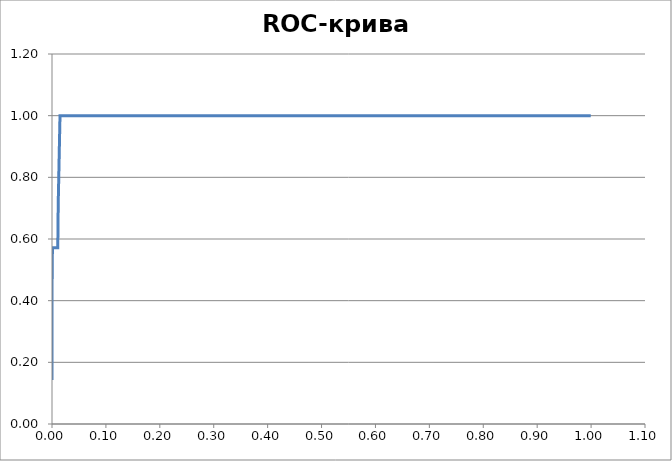
| Category | sens |
|---|---|
| 0.0 | 0.143 |
| 0.0 | 0.286 |
| 0.0 | 0.429 |
| 0.0 | 0.429 |
| 0.0008244023083264773 | 0.571 |
| 0.0008244023083264773 | 0.571 |
| 0.0016488046166529546 | 0.571 |
| 0.002473206924979432 | 0.571 |
| 0.0032976092333057982 | 0.571 |
| 0.004122011541632276 | 0.571 |
| 0.004946413849958753 | 0.571 |
| 0.00577081615828523 | 0.571 |
| 0.0065952184666117075 | 0.571 |
| 0.007419620774938185 | 0.571 |
| 0.008244023083264662 | 0.571 |
| 0.00906842539159114 | 0.571 |
| 0.009892827699917506 | 0.571 |
| 0.010717230008243983 | 0.571 |
| 0.01154163231657046 | 0.714 |
| 0.01154163231657046 | 0.714 |
| 0.012366034624896938 | 0.714 |
| 0.013190436933223415 | 0.857 |
| 0.013190436933223415 | 0.857 |
| 0.014014839241549892 | 0.857 |
| 0.01483924154987637 | 1 |
| 0.01483924154987637 | 1 |
| 0.015663643858202847 | 1 |
| 0.016488046166529213 | 1 |
| 0.01731244847485569 | 1 |
| 0.018136850783182168 | 1 |
| 0.018961253091508645 | 1 |
| 0.019785655399835123 | 1 |
| 0.0206100577081616 | 1 |
| 0.021434460016488077 | 1 |
| 0.022258862324814555 | 1 |
| 0.02308326463314092 | 1 |
| 0.023907666941467398 | 1 |
| 0.024732069249793875 | 1 |
| 0.025556471558120353 | 1 |
| 0.02638087386644683 | 1 |
| 0.027205276174773307 | 1 |
| 0.028029678483099785 | 1 |
| 0.028854080791426262 | 1 |
| 0.02967848309975263 | 1 |
| 0.030502885408079106 | 1 |
| 0.03132728771640558 | 1 |
| 0.03215169002473206 | 1 |
| 0.03297609233305854 | 1 |
| 0.033800494641385015 | 1 |
| 0.03462489694971149 | 1 |
| 0.03544929925803797 | 1 |
| 0.036273701566364336 | 1 |
| 0.03709810387469081 | 1 |
| 0.03792250618301729 | 1 |
| 0.03874690849134377 | 1 |
| 0.039571310799670245 | 1 |
| 0.04039571310799672 | 1 |
| 0.0412201154163232 | 1 |
| 0.04204451772464968 | 1 |
| 0.04286892003297604 | 1 |
| 0.04369332234130252 | 1 |
| 0.044517724649629 | 1 |
| 0.045342126957955475 | 1 |
| 0.04616652926628195 | 1 |
| 0.04699093157460843 | 1 |
| 0.04781533388293491 | 1 |
| 0.048639736191261385 | 1 |
| 0.04946413849958775 | 1 |
| 0.05028854080791423 | 1 |
| 0.051112943116240706 | 1 |
| 0.05193734542456718 | 1 |
| 0.05276174773289366 | 1 |
| 0.05358615004122014 | 1 |
| 0.054410552349546615 | 1 |
| 0.05523495465787309 | 1 |
| 0.05605935696619946 | 1 |
| 0.056883759274525936 | 1 |
| 0.05770816158285241 | 1 |
| 0.05853256389117889 | 1 |
| 0.05935696619950537 | 1 |
| 0.060181368507831845 | 1 |
| 0.06100577081615832 | 1 |
| 0.0618301731244848 | 1 |
| 0.06265457543281117 | 1 |
| 0.06347897774113764 | 1 |
| 0.06430338004946412 | 1 |
| 0.0651277823577906 | 1 |
| 0.06595218466611708 | 1 |
| 0.06677658697444355 | 1 |
| 0.06760098928277003 | 1 |
| 0.06842539159109651 | 1 |
| 0.06924979389942287 | 1 |
| 0.07007419620774935 | 1 |
| 0.07089859851607583 | 1 |
| 0.0717230008244023 | 1 |
| 0.07254740313272878 | 1 |
| 0.07337180544105526 | 1 |
| 0.07419620774938174 | 1 |
| 0.07502061005770821 | 1 |
| 0.07584501236603458 | 1 |
| 0.07666941467436106 | 1 |
| 0.07749381698268754 | 1 |
| 0.07831821929101401 | 1 |
| 0.07914262159934049 | 1 |
| 0.07996702390766697 | 1 |
| 0.08079142621599344 | 1 |
| 0.08161582852431992 | 1 |
| 0.08244023083264629 | 1 |
| 0.08326463314097277 | 1 |
| 0.08408903544929924 | 1 |
| 0.08491343775762572 | 1 |
| 0.0857378400659522 | 1 |
| 0.08656224237427868 | 1 |
| 0.08738664468260515 | 1 |
| 0.08821104699093163 | 1 |
| 0.089035449299258 | 1 |
| 0.08985985160758447 | 1 |
| 0.09068425391591095 | 1 |
| 0.09150865622423743 | 1 |
| 0.0923330585325639 | 1 |
| 0.09315746084089038 | 1 |
| 0.09398186314921686 | 1 |
| 0.09480626545754323 | 1 |
| 0.0956306677658697 | 1 |
| 0.09645507007419618 | 1 |
| 0.09727947238252266 | 1 |
| 0.09810387469084914 | 1 |
| 0.09892827699917561 | 1 |
| 0.09975267930750209 | 1 |
| 0.10057708161582857 | 1 |
| 0.10140148392415493 | 1 |
| 0.10222588623248141 | 1 |
| 0.10305028854080789 | 1 |
| 0.10387469084913437 | 1 |
| 0.10469909315746084 | 1 |
| 0.10552349546578732 | 1 |
| 0.1063478977741138 | 1 |
| 0.10717230008244027 | 1 |
| 0.10799670239076664 | 1 |
| 0.10882110469909312 | 1 |
| 0.1096455070074196 | 1 |
| 0.11046990931574607 | 1 |
| 0.11129431162407255 | 1 |
| 0.11211871393239903 | 1 |
| 0.1129431162407255 | 1 |
| 0.11376751854905198 | 1 |
| 0.11459192085737835 | 1 |
| 0.11541632316570483 | 1 |
| 0.1162407254740313 | 1 |
| 0.11706512778235778 | 1 |
| 0.11788953009068426 | 1 |
| 0.11871393239901074 | 1 |
| 0.11953833470733721 | 1 |
| 0.12036273701566369 | 1 |
| 0.12118713932399006 | 1 |
| 0.12201154163231653 | 1 |
| 0.12283594394064301 | 1 |
| 0.12366034624896949 | 1 |
| 0.12448474855729597 | 1 |
| 0.12530915086562244 | 1 |
| 0.12613355317394892 | 1 |
| 0.1269579554822754 | 1 |
| 0.12778235779060176 | 1 |
| 0.12860676009892824 | 1 |
| 0.12943116240725472 | 1 |
| 0.1302555647155812 | 1 |
| 0.13107996702390767 | 1 |
| 0.13190436933223415 | 1 |
| 0.13272877164056063 | 1 |
| 0.1335531739488871 | 1 |
| 0.13437757625721347 | 1 |
| 0.13520197856553995 | 1 |
| 0.13602638087386643 | 1 |
| 0.1368507831821929 | 1 |
| 0.13767518549051938 | 1 |
| 0.13849958779884586 | 1 |
| 0.13932399010717234 | 1 |
| 0.1401483924154988 | 1 |
| 0.14097279472382518 | 1 |
| 0.14179719703215166 | 1 |
| 0.14262159934047813 | 1 |
| 0.1434460016488046 | 1 |
| 0.1442704039571311 | 1 |
| 0.14509480626545757 | 1 |
| 0.14591920857378404 | 1 |
| 0.14674361088211052 | 1 |
| 0.1475680131904369 | 1 |
| 0.14839241549876336 | 1 |
| 0.14921681780708984 | 1 |
| 0.15004122011541632 | 1 |
| 0.1508656224237428 | 1 |
| 0.15169002473206927 | 1 |
| 0.15251442704039575 | 1 |
| 0.15333882934872223 | 1 |
| 0.1541632316570486 | 1 |
| 0.15498763396537507 | 1 |
| 0.15581203627370155 | 1 |
| 0.15663643858202803 | 1 |
| 0.1574608408903545 | 1 |
| 0.15828524319868098 | 1 |
| 0.15910964550700746 | 1 |
| 0.15993404781533394 | 1 |
| 0.1607584501236603 | 1 |
| 0.16158285243198678 | 1 |
| 0.16240725474031326 | 1 |
| 0.16323165704863973 | 1 |
| 0.1640560593569662 | 1 |
| 0.1648804616652927 | 1 |
| 0.16570486397361917 | 1 |
| 0.16652926628194564 | 1 |
| 0.167353668590272 | 1 |
| 0.1681780708985985 | 1 |
| 0.16900247320692496 | 1 |
| 0.16982687551525144 | 1 |
| 0.17065127782357792 | 1 |
| 0.1714756801319044 | 1 |
| 0.17230008244023087 | 1 |
| 0.17312448474855735 | 1 |
| 0.17394888705688372 | 1 |
| 0.1747732893652102 | 1 |
| 0.17559769167353667 | 1 |
| 0.17642209398186315 | 1 |
| 0.17724649629018963 | 1 |
| 0.1780708985985161 | 1 |
| 0.17889530090684258 | 1 |
| 0.17971970321516906 | 1 |
| 0.18054410552349542 | 1 |
| 0.1813685078318219 | 1 |
| 0.18219291014014838 | 1 |
| 0.18301731244847486 | 1 |
| 0.18384171475680133 | 1 |
| 0.1846661170651278 | 1 |
| 0.1854905193734543 | 1 |
| 0.18631492168178065 | 1 |
| 0.18713932399010713 | 1 |
| 0.1879637262984336 | 1 |
| 0.18878812860676009 | 1 |
| 0.18961253091508656 | 1 |
| 0.19043693322341304 | 1 |
| 0.19126133553173952 | 1 |
| 0.192085737840066 | 1 |
| 0.19291014014839236 | 1 |
| 0.19373454245671884 | 1 |
| 0.19455894476504532 | 1 |
| 0.1953833470733718 | 1 |
| 0.19620774938169827 | 1 |
| 0.19703215169002475 | 1 |
| 0.19785655399835123 | 1 |
| 0.1986809563066777 | 1 |
| 0.19950535861500407 | 1 |
| 0.20032976092333055 | 1 |
| 0.20115416323165702 | 1 |
| 0.2019785655399835 | 1 |
| 0.20280296784830998 | 1 |
| 0.20362737015663646 | 1 |
| 0.20445177246496293 | 1 |
| 0.2052761747732894 | 1 |
| 0.20610057708161578 | 1 |
| 0.20692497938994225 | 1 |
| 0.20774938169826873 | 1 |
| 0.2085737840065952 | 1 |
| 0.20939818631492169 | 1 |
| 0.21022258862324816 | 1 |
| 0.21104699093157464 | 1 |
| 0.21187139323990112 | 1 |
| 0.21269579554822748 | 1 |
| 0.21352019785655396 | 1 |
| 0.21434460016488044 | 1 |
| 0.21516900247320692 | 1 |
| 0.2159934047815334 | 1 |
| 0.21681780708985987 | 1 |
| 0.21764220939818635 | 1 |
| 0.21846661170651283 | 1 |
| 0.2192910140148392 | 1 |
| 0.22011541632316567 | 1 |
| 0.22093981863149215 | 1 |
| 0.22176422093981862 | 1 |
| 0.2225886232481451 | 1 |
| 0.22341302555647158 | 1 |
| 0.22423742786479806 | 1 |
| 0.22506183017312453 | 1 |
| 0.2258862324814509 | 1 |
| 0.22671063478977738 | 1 |
| 0.22753503709810385 | 1 |
| 0.22835943940643033 | 1 |
| 0.2291838417147568 | 1 |
| 0.23000824402308329 | 1 |
| 0.23083264633140976 | 1 |
| 0.23165704863973624 | 1 |
| 0.2324814509480626 | 1 |
| 0.23330585325638908 | 1 |
| 0.23413025556471556 | 1 |
| 0.23495465787304204 | 1 |
| 0.23577906018136852 | 1 |
| 0.236603462489695 | 1 |
| 0.23742786479802147 | 1 |
| 0.23825226710634795 | 1 |
| 0.23907666941467431 | 1 |
| 0.2399010717230008 | 1 |
| 0.24072547403132727 | 1 |
| 0.24154987633965375 | 1 |
| 0.24237427864798022 | 1 |
| 0.2431986809563067 | 1 |
| 0.24402308326463318 | 1 |
| 0.24484748557295966 | 1 |
| 0.24567188788128602 | 1 |
| 0.2464962901896125 | 1 |
| 0.24732069249793898 | 1 |
| 0.24814509480626545 | 1 |
| 0.24896949711459193 | 1 |
| 0.2497938994229184 | 1 |
| 0.2506183017312449 | 1 |
| 0.25144270403957136 | 1 |
| 0.25226710634789773 | 1 |
| 0.2530915086562242 | 1 |
| 0.2539159109645507 | 1 |
| 0.25474031327287716 | 1 |
| 0.25556471558120364 | 1 |
| 0.2563891178895301 | 1 |
| 0.2572135201978566 | 1 |
| 0.25803792250618307 | 1 |
| 0.25886232481450944 | 1 |
| 0.2596867271228359 | 1 |
| 0.2605111294311624 | 1 |
| 0.26133553173948887 | 1 |
| 0.26215993404781535 | 1 |
| 0.2629843363561418 | 1 |
| 0.2638087386644683 | 1 |
| 0.2646331409727948 | 1 |
| 0.26545754328112114 | 1 |
| 0.2662819455894476 | 1 |
| 0.2671063478977741 | 1 |
| 0.2679307502061006 | 1 |
| 0.26875515251442705 | 1 |
| 0.26957955482275353 | 1 |
| 0.27040395713108 | 1 |
| 0.2712283594394065 | 1 |
| 0.27205276174773285 | 1 |
| 0.27287716405605933 | 1 |
| 0.2737015663643858 | 1 |
| 0.2745259686727123 | 1 |
| 0.27535037098103876 | 1 |
| 0.27617477328936524 | 1 |
| 0.2769991755976917 | 1 |
| 0.2778235779060181 | 1 |
| 0.27864798021434456 | 1 |
| 0.27947238252267104 | 1 |
| 0.2802967848309975 | 1 |
| 0.281121187139324 | 1 |
| 0.28194558944765047 | 1 |
| 0.28276999175597695 | 1 |
| 0.2835943940643034 | 1 |
| 0.2844187963726298 | 1 |
| 0.28524319868095627 | 1 |
| 0.28606760098928274 | 1 |
| 0.2868920032976092 | 1 |
| 0.2877164056059357 | 1 |
| 0.2885408079142622 | 1 |
| 0.28936521022258865 | 1 |
| 0.29018961253091513 | 1 |
| 0.2910140148392415 | 1 |
| 0.291838417147568 | 1 |
| 0.29266281945589445 | 1 |
| 0.29348722176422093 | 1 |
| 0.2943116240725474 | 1 |
| 0.2951360263808739 | 1 |
| 0.29596042868920036 | 1 |
| 0.29678483099752684 | 1 |
| 0.2976092333058532 | 1 |
| 0.2984336356141797 | 1 |
| 0.29925803792250616 | 1 |
| 0.30008244023083264 | 1 |
| 0.3009068425391591 | 1 |
| 0.3017312448474856 | 1 |
| 0.30255564715581207 | 1 |
| 0.30338004946413855 | 1 |
| 0.3042044517724649 | 1 |
| 0.3050288540807914 | 1 |
| 0.30585325638911787 | 1 |
| 0.30667765869744434 | 1 |
| 0.3075020610057708 | 1 |
| 0.3083264633140973 | 1 |
| 0.3091508656224238 | 1 |
| 0.30997526793075025 | 1 |
| 0.3107996702390766 | 1 |
| 0.3116240725474031 | 1 |
| 0.3124484748557296 | 1 |
| 0.31327287716405605 | 1 |
| 0.31409727947238253 | 1 |
| 0.314921681780709 | 1 |
| 0.3157460840890355 | 1 |
| 0.31657048639736196 | 1 |
| 0.3173948887056883 | 1 |
| 0.3182192910140148 | 1 |
| 0.3190436933223413 | 1 |
| 0.31986809563066776 | 1 |
| 0.32069249793899424 | 1 |
| 0.3215169002473207 | 1 |
| 0.3223413025556472 | 1 |
| 0.32316570486397367 | 1 |
| 0.32399010717230003 | 1 |
| 0.3248145094806265 | 1 |
| 0.325638911788953 | 1 |
| 0.32646331409727947 | 1 |
| 0.32728771640560594 | 1 |
| 0.3281121187139324 | 1 |
| 0.3289365210222589 | 1 |
| 0.3297609233305854 | 1 |
| 0.33058532563891174 | 1 |
| 0.3314097279472382 | 1 |
| 0.3322341302555647 | 1 |
| 0.3330585325638912 | 1 |
| 0.33388293487221765 | 1 |
| 0.33470733718054413 | 1 |
| 0.3355317394888706 | 1 |
| 0.3363561417971971 | 1 |
| 0.33718054410552345 | 1 |
| 0.3380049464138499 | 1 |
| 0.3388293487221764 | 1 |
| 0.3396537510305029 | 1 |
| 0.34047815333882936 | 1 |
| 0.34130255564715584 | 1 |
| 0.3421269579554823 | 1 |
| 0.3429513602638088 | 1 |
| 0.34377576257213516 | 1 |
| 0.34460016488046163 | 1 |
| 0.3454245671887881 | 1 |
| 0.3462489694971146 | 1 |
| 0.34707337180544107 | 1 |
| 0.34789777411376754 | 1 |
| 0.348722176422094 | 1 |
| 0.3495465787304205 | 1 |
| 0.35037098103874686 | 1 |
| 0.35119538334707334 | 1 |
| 0.3520197856553998 | 1 |
| 0.3528441879637263 | 1 |
| 0.3536685902720528 | 1 |
| 0.35449299258037925 | 1 |
| 0.35531739488870573 | 1 |
| 0.3561417971970322 | 1 |
| 0.3569661995053586 | 1 |
| 0.35779060181368505 | 1 |
| 0.3586150041220115 | 1 |
| 0.359439406430338 | 1 |
| 0.3602638087386645 | 1 |
| 0.36108821104699096 | 1 |
| 0.36191261335531744 | 1 |
| 0.3627370156636439 | 1 |
| 0.3635614179719703 | 1 |
| 0.36438582028029676 | 1 |
| 0.36521022258862323 | 1 |
| 0.3660346248969497 | 1 |
| 0.3668590272052762 | 1 |
| 0.36768342951360267 | 1 |
| 0.36850783182192914 | 1 |
| 0.3693322341302555 | 1 |
| 0.370156636438582 | 1 |
| 0.37098103874690846 | 1 |
| 0.37180544105523494 | 1 |
| 0.3726298433635614 | 1 |
| 0.3734542456718879 | 1 |
| 0.3742786479802144 | 1 |
| 0.37510305028854085 | 1 |
| 0.3759274525968672 | 1 |
| 0.3767518549051937 | 1 |
| 0.37757625721352017 | 1 |
| 0.37840065952184665 | 1 |
| 0.3792250618301731 | 1 |
| 0.3800494641384996 | 1 |
| 0.3808738664468261 | 1 |
| 0.38169826875515256 | 1 |
| 0.3825226710634789 | 1 |
| 0.3833470733718054 | 1 |
| 0.3841714756801319 | 1 |
| 0.38499587798845836 | 1 |
| 0.38582028029678483 | 1 |
| 0.3866446826051113 | 1 |
| 0.3874690849134378 | 1 |
| 0.38829348722176427 | 1 |
| 0.38911788953009063 | 1 |
| 0.3899422918384171 | 1 |
| 0.3907666941467436 | 1 |
| 0.39159109645507006 | 1 |
| 0.39241549876339654 | 1 |
| 0.393239901071723 | 1 |
| 0.3940643033800495 | 1 |
| 0.394888705688376 | 1 |
| 0.39571310799670234 | 1 |
| 0.3965375103050288 | 1 |
| 0.3973619126133553 | 1 |
| 0.39818631492168177 | 1 |
| 0.39901071723000825 | 1 |
| 0.3998351195383347 | 1 |
| 0.4006595218466612 | 1 |
| 0.4014839241549877 | 1 |
| 0.40230832646331405 | 1 |
| 0.4031327287716405 | 1 |
| 0.403957131079967 | 1 |
| 0.4047815333882935 | 1 |
| 0.40560593569661996 | 1 |
| 0.40643033800494643 | 1 |
| 0.4072547403132729 | 1 |
| 0.4080791426215994 | 1 |
| 0.40890354492992576 | 1 |
| 0.40972794723825223 | 1 |
| 0.4105523495465787 | 1 |
| 0.4113767518549052 | 1 |
| 0.41220115416323166 | 1 |
| 0.41302555647155814 | 1 |
| 0.4138499587798846 | 1 |
| 0.4146743610882111 | 1 |
| 0.41549876339653746 | 1 |
| 0.41632316570486394 | 1 |
| 0.4171475680131904 | 1 |
| 0.4179719703215169 | 1 |
| 0.41879637262984337 | 1 |
| 0.41962077493816985 | 1 |
| 0.4204451772464963 | 1 |
| 0.4212695795548228 | 1 |
| 0.42209398186314917 | 1 |
| 0.42291838417147565 | 1 |
| 0.4237427864798021 | 1 |
| 0.4245671887881286 | 1 |
| 0.4253915910964551 | 1 |
| 0.42621599340478156 | 1 |
| 0.42704039571310803 | 1 |
| 0.4278647980214345 | 1 |
| 0.4286892003297609 | 1 |
| 0.42951360263808736 | 1 |
| 0.43033800494641383 | 1 |
| 0.4311624072547403 | 1 |
| 0.4319868095630668 | 1 |
| 0.43281121187139326 | 1 |
| 0.43363561417971974 | 1 |
| 0.4344600164880462 | 1 |
| 0.4352844187963726 | 1 |
| 0.43610882110469906 | 1 |
| 0.43693322341302554 | 1 |
| 0.437757625721352 | 1 |
| 0.4385820280296785 | 1 |
| 0.43940643033800497 | 1 |
| 0.44023083264633145 | 1 |
| 0.4410552349546579 | 1 |
| 0.4418796372629843 | 1 |
| 0.44270403957131077 | 1 |
| 0.44352844187963725 | 1 |
| 0.4443528441879637 | 1 |
| 0.4451772464962902 | 1 |
| 0.4460016488046167 | 1 |
| 0.44682605111294316 | 1 |
| 0.44765045342126963 | 1 |
| 0.448474855729596 | 1 |
| 0.4492992580379225 | 1 |
| 0.45012366034624895 | 1 |
| 0.45094806265457543 | 1 |
| 0.4517724649629019 | 1 |
| 0.4525968672712284 | 1 |
| 0.45342126957955486 | 1 |
| 0.45424567188788134 | 1 |
| 0.4550700741962077 | 1 |
| 0.4558944765045342 | 1 |
| 0.45671887881286066 | 1 |
| 0.45754328112118714 | 1 |
| 0.4583676834295136 | 1 |
| 0.4591920857378401 | 1 |
| 0.46001648804616657 | 1 |
| 0.46084089035449294 | 1 |
| 0.4616652926628194 | 1 |
| 0.4624896949711459 | 1 |
| 0.46331409727947237 | 1 |
| 0.46413849958779885 | 1 |
| 0.4649629018961253 | 1 |
| 0.4657873042044518 | 1 |
| 0.4666117065127783 | 1 |
| 0.46743610882110465 | 1 |
| 0.4682605111294311 | 1 |
| 0.4690849134377576 | 1 |
| 0.4699093157460841 | 1 |
| 0.47073371805441055 | 1 |
| 0.47155812036273703 | 1 |
| 0.4723825226710635 | 1 |
| 0.47320692497939 | 1 |
| 0.47403132728771635 | 1 |
| 0.47485572959604283 | 1 |
| 0.4756801319043693 | 1 |
| 0.4765045342126958 | 1 |
| 0.47732893652102226 | 1 |
| 0.47815333882934874 | 1 |
| 0.4789777411376752 | 1 |
| 0.4798021434460017 | 1 |
| 0.48062654575432806 | 1 |
| 0.48145094806265454 | 1 |
| 0.482275350370981 | 1 |
| 0.4830997526793075 | 1 |
| 0.48392415498763397 | 1 |
| 0.48474855729596045 | 1 |
| 0.4855729596042869 | 1 |
| 0.4863973619126134 | 1 |
| 0.48722176422093977 | 1 |
| 0.48804616652926625 | 1 |
| 0.4888705688375927 | 1 |
| 0.4896949711459192 | 1 |
| 0.4905193734542457 | 1 |
| 0.49134377576257215 | 1 |
| 0.49216817807089863 | 1 |
| 0.4929925803792251 | 1 |
| 0.4938169826875515 | 1 |
| 0.49464138499587795 | 1 |
| 0.49546578730420443 | 1 |
| 0.4962901896125309 | 1 |
| 0.4971145919208574 | 1 |
| 0.49793899422918386 | 1 |
| 0.49876339653751034 | 1 |
| 0.4995877988458368 | 1 |
| 0.5004122011541632 | 1 |
| 0.5012366034624898 | 1 |
| 0.5020610057708161 | 1 |
| 0.5028854080791426 | 1 |
| 0.5037098103874691 | 1 |
| 0.5045342126957956 | 1 |
| 0.505358615004122 | 1 |
| 0.5061830173124484 | 1 |
| 0.507007419620775 | 1 |
| 0.5078318219291014 | 1 |
| 0.5086562242374278 | 1 |
| 0.5094806265457543 | 1 |
| 0.5103050288540808 | 1 |
| 0.5111294311624073 | 1 |
| 0.5119538334707336 | 1 |
| 0.5127782357790602 | 1 |
| 0.5136026380873866 | 1 |
| 0.5144270403957132 | 1 |
| 0.5152514427040396 | 1 |
| 0.516075845012366 | 1 |
| 0.5169002473206925 | 1 |
| 0.517724649629019 | 1 |
| 0.5185490519373455 | 1 |
| 0.5193734542456718 | 1 |
| 0.5201978565539984 | 1 |
| 0.5210222588623248 | 1 |
| 0.5218466611706513 | 1 |
| 0.5226710634789777 | 1 |
| 0.5234954657873042 | 1 |
| 0.5243198680956307 | 1 |
| 0.5251442704039571 | 1 |
| 0.5259686727122836 | 1 |
| 0.52679307502061 | 1 |
| 0.5276174773289366 | 1 |
| 0.528441879637263 | 1 |
| 0.5292662819455894 | 1 |
| 0.5300906842539159 | 1 |
| 0.5309150865622424 | 1 |
| 0.5317394888705689 | 1 |
| 0.5325638911788952 | 1 |
| 0.5333882934872218 | 1 |
| 0.5342126957955482 | 1 |
| 0.5350370981038747 | 1 |
| 0.5358615004122012 | 1 |
| 0.5366859027205276 | 1 |
| 0.5375103050288541 | 1 |
| 0.5383347073371805 | 1 |
| 0.5391591096455071 | 1 |
| 0.5399835119538334 | 1 |
| 0.54080791426216 | 1 |
| 0.5416323165704864 | 1 |
| 0.5424567188788129 | 1 |
| 0.5432811211871393 | 1 |
| 0.5441055234954658 | 1 |
| 0.5449299258037923 | 1 |
| 0.5457543281121187 | 1 |
| 0.5465787304204452 | 1 |
| 0.5474031327287716 | 1 |
| 0.5482275350370981 | 1 |
| 0.5490519373454246 | 1 |
| 0.549876339653751 | 1 |
| 0.5507007419620775 | 1 |
| 0.5515251442704039 | 1 |
| 0.5523495465787305 | 1 |
| 0.5531739488870568 | 1 |
| 0.5539983511953833 | 1 |
| 0.5548227535037098 | 1 |
| 0.5556471558120363 | 1 |
| 0.5564715581203628 | 1 |
| 0.5572959604286891 | 1 |
| 0.5581203627370157 | 1 |
| 0.5589447650453421 | 1 |
| 0.5597691673536687 | 1 |
| 0.560593569661995 | 1 |
| 0.5614179719703215 | 1 |
| 0.562242374278648 | 1 |
| 0.5630667765869745 | 1 |
| 0.5638911788953009 | 1 |
| 0.5647155812036273 | 1 |
| 0.5655399835119539 | 1 |
| 0.5663643858202803 | 1 |
| 0.5671887881286067 | 1 |
| 0.5680131904369332 | 1 |
| 0.5688375927452597 | 1 |
| 0.5696619950535862 | 1 |
| 0.5704863973619125 | 1 |
| 0.5713107996702391 | 1 |
| 0.5721352019785655 | 1 |
| 0.5729596042868921 | 1 |
| 0.5737840065952184 | 1 |
| 0.5746084089035449 | 1 |
| 0.5754328112118714 | 1 |
| 0.5762572135201979 | 1 |
| 0.5770816158285244 | 1 |
| 0.5779060181368507 | 1 |
| 0.5787304204451773 | 1 |
| 0.5795548227535037 | 1 |
| 0.5803792250618302 | 1 |
| 0.5812036273701566 | 1 |
| 0.5820280296784831 | 1 |
| 0.5828524319868096 | 1 |
| 0.583676834295136 | 1 |
| 0.5845012366034625 | 1 |
| 0.5853256389117889 | 1 |
| 0.5861500412201155 | 1 |
| 0.5869744435284419 | 1 |
| 0.5877988458367683 | 1 |
| 0.5886232481450948 | 1 |
| 0.5894476504534213 | 1 |
| 0.5902720527617478 | 1 |
| 0.5910964550700741 | 1 |
| 0.5919208573784007 | 1 |
| 0.5927452596867271 | 1 |
| 0.5935696619950536 | 1 |
| 0.59439406430338 | 1 |
| 0.5952184666117065 | 1 |
| 0.596042868920033 | 1 |
| 0.5968672712283594 | 1 |
| 0.597691673536686 | 1 |
| 0.5985160758450123 | 1 |
| 0.5993404781533389 | 1 |
| 0.6001648804616653 | 1 |
| 0.6009892827699918 | 1 |
| 0.6018136850783182 | 1 |
| 0.6026380873866447 | 1 |
| 0.6034624896949712 | 1 |
| 0.6042868920032975 | 1 |
| 0.6051112943116241 | 1 |
| 0.6059356966199505 | 1 |
| 0.606760098928277 | 1 |
| 0.6075845012366035 | 1 |
| 0.6084089035449299 | 1 |
| 0.6092333058532564 | 1 |
| 0.6100577081615828 | 1 |
| 0.6108821104699094 | 1 |
| 0.6117065127782357 | 1 |
| 0.6125309150865623 | 1 |
| 0.6133553173948887 | 1 |
| 0.6141797197032152 | 1 |
| 0.6150041220115416 | 1 |
| 0.6158285243198681 | 1 |
| 0.6166529266281946 | 1 |
| 0.617477328936521 | 1 |
| 0.6183017312448476 | 1 |
| 0.6191261335531739 | 1 |
| 0.6199505358615004 | 1 |
| 0.6207749381698269 | 1 |
| 0.6215993404781534 | 1 |
| 0.6224237427864798 | 1 |
| 0.6232481450948062 | 1 |
| 0.6240725474031328 | 1 |
| 0.6248969497114591 | 1 |
| 0.6257213520197857 | 1 |
| 0.6265457543281121 | 1 |
| 0.6273701566364386 | 1 |
| 0.6281945589447651 | 1 |
| 0.6290189612530915 | 1 |
| 0.629843363561418 | 1 |
| 0.6306677658697444 | 1 |
| 0.631492168178071 | 1 |
| 0.6323165704863973 | 1 |
| 0.6331409727947238 | 1 |
| 0.6339653751030503 | 1 |
| 0.6347897774113768 | 1 |
| 0.6356141797197032 | 1 |
| 0.6364385820280296 | 1 |
| 0.6372629843363562 | 1 |
| 0.6380873866446826 | 1 |
| 0.638911788953009 | 1 |
| 0.6397361912613355 | 1 |
| 0.640560593569662 | 1 |
| 0.6413849958779885 | 1 |
| 0.6422093981863148 | 1 |
| 0.6430338004946414 | 1 |
| 0.6438582028029678 | 1 |
| 0.6446826051112944 | 1 |
| 0.6455070074196207 | 1 |
| 0.6463314097279472 | 1 |
| 0.6471558120362737 | 1 |
| 0.6479802143446002 | 1 |
| 0.6488046166529267 | 1 |
| 0.649629018961253 | 1 |
| 0.6504534212695796 | 1 |
| 0.651277823577906 | 1 |
| 0.6521022258862325 | 1 |
| 0.6529266281945589 | 1 |
| 0.6537510305028854 | 1 |
| 0.6545754328112119 | 1 |
| 0.6553998351195383 | 1 |
| 0.6562242374278648 | 1 |
| 0.6570486397361912 | 1 |
| 0.6578730420445178 | 1 |
| 0.6586974443528442 | 1 |
| 0.6595218466611706 | 1 |
| 0.6603462489694971 | 1 |
| 0.6611706512778236 | 1 |
| 0.6619950535861501 | 1 |
| 0.6628194558944764 | 1 |
| 0.663643858202803 | 1 |
| 0.6644682605111294 | 1 |
| 0.6652926628194559 | 1 |
| 0.6661170651277823 | 1 |
| 0.6669414674361088 | 1 |
| 0.6677658697444353 | 1 |
| 0.6685902720527617 | 1 |
| 0.6694146743610883 | 1 |
| 0.6702390766694146 | 1 |
| 0.6710634789777412 | 1 |
| 0.6718878812860676 | 1 |
| 0.6727122835943941 | 1 |
| 0.6735366859027205 | 1 |
| 0.674361088211047 | 1 |
| 0.6751854905193735 | 1 |
| 0.6760098928276999 | 1 |
| 0.6768342951360264 | 1 |
| 0.6776586974443528 | 1 |
| 0.6784830997526793 | 1 |
| 0.6793075020610058 | 1 |
| 0.6801319043693322 | 1 |
| 0.6809563066776587 | 1 |
| 0.6817807089859851 | 1 |
| 0.6826051112943117 | 1 |
| 0.683429513602638 | 1 |
| 0.6842539159109646 | 1 |
| 0.685078318219291 | 1 |
| 0.6859027205276175 | 1 |
| 0.686727122835944 | 1 |
| 0.6875515251442704 | 1 |
| 0.6883759274525969 | 1 |
| 0.6892003297609233 | 1 |
| 0.6900247320692499 | 1 |
| 0.6908491343775762 | 1 |
| 0.6916735366859027 | 1 |
| 0.6924979389942292 | 1 |
| 0.6933223413025557 | 1 |
| 0.6941467436108821 | 1 |
| 0.6949711459192085 | 1 |
| 0.6957955482275351 | 1 |
| 0.6966199505358615 | 1 |
| 0.697444352844188 | 1 |
| 0.6982687551525144 | 1 |
| 0.6990931574608409 | 1 |
| 0.6999175597691674 | 1 |
| 0.7007419620774938 | 1 |
| 0.7015663643858203 | 1 |
| 0.7023907666941467 | 1 |
| 0.7032151690024733 | 1 |
| 0.7040395713107996 | 1 |
| 0.7048639736191261 | 1 |
| 0.7056883759274526 | 1 |
| 0.7065127782357791 | 1 |
| 0.7073371805441055 | 1 |
| 0.7081615828524319 | 1 |
| 0.7089859851607585 | 1 |
| 0.7098103874690849 | 1 |
| 0.7106347897774115 | 1 |
| 0.7114591920857378 | 1 |
| 0.7122835943940643 | 1 |
| 0.7131079967023908 | 1 |
| 0.7139323990107173 | 1 |
| 0.7147568013190437 | 1 |
| 0.7155812036273701 | 1 |
| 0.7164056059356967 | 1 |
| 0.717230008244023 | 1 |
| 0.7180544105523495 | 1 |
| 0.718878812860676 | 1 |
| 0.7197032151690025 | 1 |
| 0.720527617477329 | 1 |
| 0.7213520197856553 | 1 |
| 0.7221764220939819 | 1 |
| 0.7230008244023083 | 1 |
| 0.7238252267106349 | 1 |
| 0.7246496290189612 | 1 |
| 0.7254740313272877 | 1 |
| 0.7262984336356142 | 1 |
| 0.7271228359439407 | 1 |
| 0.7279472382522671 | 1 |
| 0.7287716405605935 | 1 |
| 0.7295960428689201 | 1 |
| 0.7304204451772465 | 1 |
| 0.731244847485573 | 1 |
| 0.7320692497938994 | 1 |
| 0.7328936521022259 | 1 |
| 0.7337180544105524 | 1 |
| 0.7345424567188787 | 1 |
| 0.7353668590272053 | 1 |
| 0.7361912613355317 | 1 |
| 0.7370156636438582 | 1 |
| 0.7378400659521847 | 1 |
| 0.7386644682605111 | 1 |
| 0.7394888705688376 | 1 |
| 0.740313272877164 | 1 |
| 0.7411376751854906 | 1 |
| 0.7419620774938169 | 1 |
| 0.7427864798021435 | 1 |
| 0.7436108821104699 | 1 |
| 0.7444352844187964 | 1 |
| 0.7452596867271228 | 1 |
| 0.7460840890354493 | 1 |
| 0.7469084913437758 | 1 |
| 0.7477328936521022 | 1 |
| 0.7485572959604287 | 1 |
| 0.7493816982687551 | 1 |
| 0.7502061005770816 | 1 |
| 0.7510305028854081 | 1 |
| 0.7518549051937345 | 1 |
| 0.752679307502061 | 1 |
| 0.7535037098103875 | 1 |
| 0.754328112118714 | 1 |
| 0.7551525144270403 | 1 |
| 0.7559769167353668 | 1 |
| 0.7568013190436933 | 1 |
| 0.7576257213520198 | 1 |
| 0.7584501236603463 | 1 |
| 0.7592745259686727 | 1 |
| 0.7600989282769992 | 1 |
| 0.7609233305853256 | 1 |
| 0.7617477328936522 | 1 |
| 0.7625721352019785 | 1 |
| 0.763396537510305 | 1 |
| 0.7642209398186315 | 1 |
| 0.765045342126958 | 1 |
| 0.7658697444352844 | 1 |
| 0.7666941467436109 | 1 |
| 0.7675185490519374 | 1 |
| 0.7683429513602638 | 1 |
| 0.7691673536685902 | 1 |
| 0.7699917559769167 | 1 |
| 0.7708161582852432 | 1 |
| 0.7716405605935697 | 1 |
| 0.7724649629018961 | 1 |
| 0.7732893652102226 | 1 |
| 0.774113767518549 | 1 |
| 0.7749381698268756 | 1 |
| 0.7757625721352019 | 1 |
| 0.7765869744435284 | 1 |
| 0.7774113767518549 | 1 |
| 0.7782357790601814 | 1 |
| 0.7790601813685079 | 1 |
| 0.7798845836768343 | 1 |
| 0.7807089859851608 | 1 |
| 0.7815333882934872 | 1 |
| 0.7823577906018137 | 1 |
| 0.7831821929101401 | 1 |
| 0.7840065952184666 | 1 |
| 0.7848309975267931 | 1 |
| 0.7856553998351196 | 1 |
| 0.786479802143446 | 1 |
| 0.7873042044517724 | 1 |
| 0.788128606760099 | 1 |
| 0.7889530090684254 | 1 |
| 0.7897774113767518 | 1 |
| 0.7906018136850783 | 1 |
| 0.7914262159934048 | 1 |
| 0.7922506183017313 | 1 |
| 0.7930750206100577 | 1 |
| 0.7938994229183842 | 1 |
| 0.7947238252267106 | 1 |
| 0.7955482275350371 | 1 |
| 0.7963726298433635 | 1 |
| 0.79719703215169 | 1 |
| 0.7980214344600165 | 1 |
| 0.798845836768343 | 1 |
| 0.7996702390766695 | 1 |
| 0.8004946413849958 | 1 |
| 0.8013190436933224 | 1 |
| 0.8021434460016488 | 1 |
| 0.8029678483099753 | 1 |
| 0.8037922506183017 | 1 |
| 0.8046166529266282 | 1 |
| 0.8054410552349547 | 1 |
| 0.8062654575432812 | 1 |
| 0.8070898598516076 | 1 |
| 0.807914262159934 | 1 |
| 0.8087386644682605 | 1 |
| 0.809563066776587 | 1 |
| 0.8103874690849134 | 1 |
| 0.8112118713932399 | 1 |
| 0.8120362737015664 | 1 |
| 0.8128606760098929 | 1 |
| 0.8136850783182192 | 1 |
| 0.8145094806265458 | 1 |
| 0.8153338829348722 | 1 |
| 0.8161582852431987 | 1 |
| 0.8169826875515251 | 1 |
| 0.8178070898598516 | 1 |
| 0.8186314921681781 | 1 |
| 0.8194558944765045 | 1 |
| 0.820280296784831 | 1 |
| 0.8211046990931574 | 1 |
| 0.8219291014014839 | 1 |
| 0.8227535037098104 | 1 |
| 0.8235779060181369 | 1 |
| 0.8244023083264633 | 1 |
| 0.8252267106347898 | 1 |
| 0.8260511129431163 | 1 |
| 0.8268755152514426 | 1 |
| 0.8276999175597691 | 1 |
| 0.8285243198680956 | 1 |
| 0.8293487221764221 | 1 |
| 0.8301731244847486 | 1 |
| 0.830997526793075 | 1 |
| 0.8318219291014015 | 1 |
| 0.8326463314097279 | 1 |
| 0.8334707337180545 | 1 |
| 0.8342951360263808 | 1 |
| 0.8351195383347073 | 1 |
| 0.8359439406430338 | 1 |
| 0.8367683429513603 | 1 |
| 0.8375927452596867 | 1 |
| 0.8384171475680132 | 1 |
| 0.8392415498763397 | 1 |
| 0.8400659521846661 | 1 |
| 0.8408903544929925 | 1 |
| 0.841714756801319 | 1 |
| 0.8425391591096455 | 1 |
| 0.843363561417972 | 1 |
| 0.8441879637262985 | 1 |
| 0.8450123660346249 | 1 |
| 0.8458367683429513 | 1 |
| 0.8466611706512779 | 1 |
| 0.8474855729596042 | 1 |
| 0.8483099752679307 | 1 |
| 0.8491343775762572 | 1 |
| 0.8499587798845837 | 1 |
| 0.8507831821929102 | 1 |
| 0.8516075845012366 | 1 |
| 0.8524319868095631 | 1 |
| 0.8532563891178895 | 1 |
| 0.854080791426216 | 1 |
| 0.8549051937345424 | 1 |
| 0.8557295960428689 | 1 |
| 0.8565539983511954 | 1 |
| 0.8573784006595219 | 1 |
| 0.8582028029678483 | 1 |
| 0.8590272052761747 | 1 |
| 0.8598516075845013 | 1 |
| 0.8606760098928277 | 1 |
| 0.8615004122011541 | 1 |
| 0.8623248145094806 | 1 |
| 0.8631492168178071 | 1 |
| 0.8639736191261336 | 1 |
| 0.86479802143446 | 1 |
| 0.8656224237427865 | 1 |
| 0.8664468260511129 | 1 |
| 0.8672712283594394 | 1 |
| 0.8680956306677658 | 1 |
| 0.8689200329760923 | 1 |
| 0.8697444352844188 | 1 |
| 0.8705688375927453 | 1 |
| 0.8713932399010718 | 1 |
| 0.8722176422093981 | 1 |
| 0.8730420445177247 | 1 |
| 0.8738664468260511 | 1 |
| 0.8746908491343776 | 1 |
| 0.875515251442704 | 1 |
| 0.8763396537510305 | 1 |
| 0.877164056059357 | 1 |
| 0.8779884583676835 | 1 |
| 0.8788128606760099 | 1 |
| 0.8796372629843363 | 1 |
| 0.8804616652926628 | 1 |
| 0.8812860676009893 | 1 |
| 0.8821104699093157 | 1 |
| 0.8829348722176422 | 1 |
| 0.8837592745259687 | 1 |
| 0.8845836768342952 | 1 |
| 0.8854080791426215 | 1 |
| 0.886232481450948 | 1 |
| 0.8870568837592745 | 1 |
| 0.887881286067601 | 1 |
| 0.8887056883759274 | 1 |
| 0.8895300906842539 | 1 |
| 0.8903544929925804 | 1 |
| 0.8911788953009069 | 1 |
| 0.8920032976092334 | 1 |
| 0.8928276999175597 | 1 |
| 0.8936521022258862 | 1 |
| 0.8944765045342127 | 1 |
| 0.8953009068425392 | 1 |
| 0.8961253091508656 | 1 |
| 0.8969497114591921 | 1 |
| 0.8977741137675186 | 1 |
| 0.898598516075845 | 1 |
| 0.8994229183841714 | 1 |
| 0.9002473206924979 | 1 |
| 0.9010717230008244 | 1 |
| 0.9018961253091509 | 1 |
| 0.9027205276174773 | 1 |
| 0.9035449299258038 | 1 |
| 0.9043693322341303 | 1 |
| 0.9051937345424568 | 1 |
| 0.9060181368507831 | 1 |
| 0.9068425391591096 | 1 |
| 0.9076669414674361 | 1 |
| 0.9084913437757626 | 1 |
| 0.909315746084089 | 1 |
| 0.9101401483924155 | 1 |
| 0.910964550700742 | 1 |
| 0.9117889530090684 | 1 |
| 0.9126133553173948 | 1 |
| 0.9134377576257213 | 1 |
| 0.9142621599340478 | 1 |
| 0.9150865622423743 | 1 |
| 0.9159109645507008 | 1 |
| 0.9167353668590272 | 1 |
| 0.9175597691673537 | 1 |
| 0.9183841714756802 | 1 |
| 0.9192085737840066 | 1 |
| 0.920032976092333 | 1 |
| 0.9208573784006595 | 1 |
| 0.921681780708986 | 1 |
| 0.9225061830173125 | 1 |
| 0.9233305853256389 | 1 |
| 0.9241549876339654 | 1 |
| 0.9249793899422918 | 1 |
| 0.9258037922506183 | 1 |
| 0.9266281945589447 | 1 |
| 0.9274525968672712 | 1 |
| 0.9282769991755977 | 1 |
| 0.9291014014839242 | 1 |
| 0.9299258037922506 | 1 |
| 0.9307502061005771 | 1 |
| 0.9315746084089036 | 1 |
| 0.93239901071723 | 1 |
| 0.9332234130255564 | 1 |
| 0.9340478153338829 | 1 |
| 0.9348722176422094 | 1 |
| 0.9356966199505359 | 1 |
| 0.9365210222588624 | 1 |
| 0.9373454245671888 | 1 |
| 0.9381698268755152 | 1 |
| 0.9389942291838417 | 1 |
| 0.9398186314921682 | 1 |
| 0.9406430338004946 | 1 |
| 0.9414674361088211 | 1 |
| 0.9422918384171476 | 1 |
| 0.9431162407254741 | 1 |
| 0.9439406430338005 | 1 |
| 0.9447650453421269 | 1 |
| 0.9455894476504534 | 1 |
| 0.9464138499587799 | 1 |
| 0.9472382522671063 | 1 |
| 0.9480626545754328 | 1 |
| 0.9488870568837593 | 1 |
| 0.9497114591920858 | 1 |
| 0.9505358615004122 | 1 |
| 0.9513602638087386 | 1 |
| 0.9521846661170651 | 1 |
| 0.9530090684253916 | 1 |
| 0.953833470733718 | 1 |
| 0.9546578730420445 | 1 |
| 0.955482275350371 | 1 |
| 0.9563066776586975 | 1 |
| 0.957131079967024 | 1 |
| 0.9579554822753503 | 1 |
| 0.9587798845836768 | 1 |
| 0.9596042868920033 | 1 |
| 0.9604286892003298 | 1 |
| 0.9612530915086562 | 1 |
| 0.9620774938169827 | 1 |
| 0.9629018961253092 | 1 |
| 0.9637262984336357 | 1 |
| 0.964550700741962 | 1 |
| 0.9653751030502885 | 1 |
| 0.966199505358615 | 1 |
| 0.9670239076669415 | 1 |
| 0.9678483099752679 | 1 |
| 0.9686727122835944 | 1 |
| 0.9694971145919209 | 1 |
| 0.9703215169002474 | 1 |
| 0.9711459192085737 | 1 |
| 0.9719703215169002 | 1 |
| 0.9727947238252267 | 1 |
| 0.9736191261335532 | 1 |
| 0.9744435284418796 | 1 |
| 0.9752679307502061 | 1 |
| 0.9760923330585326 | 1 |
| 0.9769167353668591 | 1 |
| 0.9777411376751854 | 1 |
| 0.9785655399835119 | 1 |
| 0.9793899422918384 | 1 |
| 0.9802143446001649 | 1 |
| 0.9810387469084914 | 1 |
| 0.9818631492168178 | 1 |
| 0.9826875515251443 | 1 |
| 0.9835119538334708 | 1 |
| 0.9843363561417972 | 1 |
| 0.9851607584501236 | 1 |
| 0.9859851607584501 | 1 |
| 0.9868095630667766 | 1 |
| 0.9876339653751031 | 1 |
| 0.9884583676834295 | 1 |
| 0.989282769991756 | 1 |
| 0.9901071723000825 | 1 |
| 0.9909315746084089 | 1 |
| 0.9917559769167353 | 1 |
| 0.9925803792250618 | 1 |
| 0.9934047815333883 | 1 |
| 0.9942291838417148 | 1 |
| 0.9950535861500412 | 1 |
| 0.9958779884583677 | 1 |
| 0.9967023907666942 | 1 |
| 0.9975267930750206 | 1 |
| 0.998351195383347 | 1 |
| 0.9991755976916735 | 1 |
| 0.998351195383347 | 1 |
| 0.9975267930750206 | 1 |